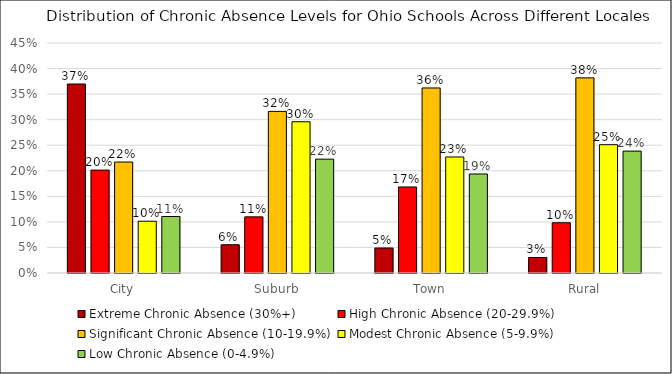
| Category | Extreme Chronic Absence (30%+) | High Chronic Absence (20-29.9%) | Significant Chronic Absence (10-19.9%) | Modest Chronic Absence (5-9.9%) | Low Chronic Absence (0-4.9%) |
|---|---|---|---|---|---|
| City | 0.37 | 0.201 | 0.217 | 0.101 | 0.111 |
| Suburb | 0.055 | 0.11 | 0.316 | 0.296 | 0.223 |
| Town | 0.049 | 0.168 | 0.362 | 0.227 | 0.194 |
| Rural | 0.03 | 0.098 | 0.382 | 0.251 | 0.238 |